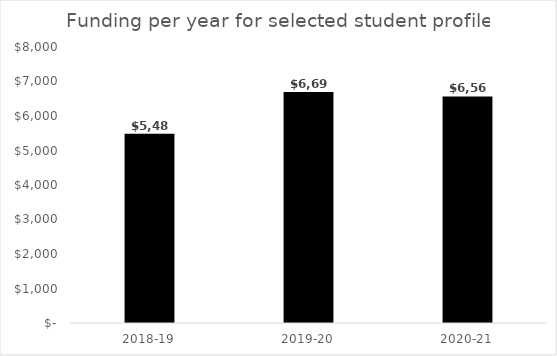
| Category | Funding per year for selected student profile |
|---|---|
| 2018-19 | 5487 |
| 2019-20 | 6695 |
| 2020-21 | 6566 |